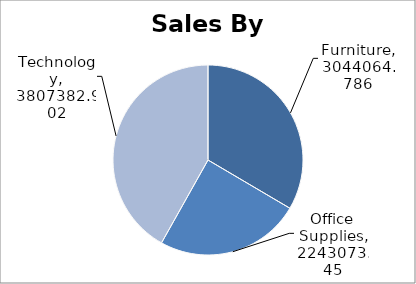
| Category | Total |
|---|---|
| Furniture | 3044064.786 |
| Office Supplies | 2243073.45 |
| Technology | 3807382.902 |